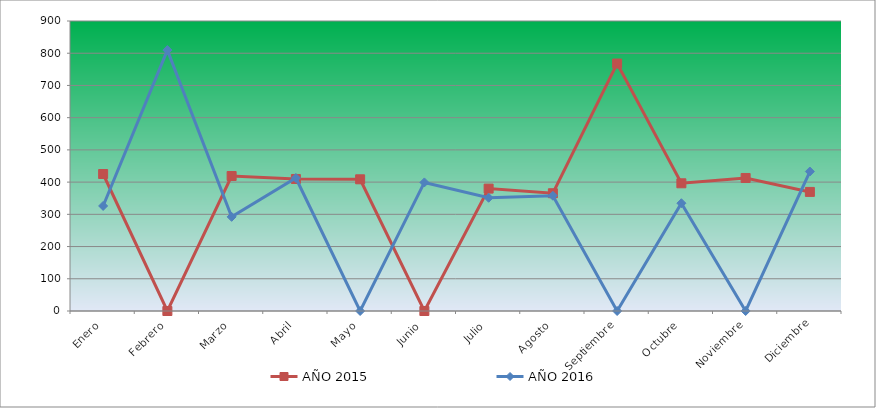
| Category | AÑO 2015 | AÑO 2016 |
|---|---|---|
| Enero | 425.161 | 326.009 |
| Febrero | 0 | 809.73 |
| Marzo | 418.984 | 292.138 |
| Abril | 409.719 | 412.804 |
| Mayo | 408.689 | 0 |
| Junio | 0 | 399.044 |
| Julio | 379.865 | 351.412 |
| Agosto | 365.453 | 357.763 |
| Septiembre | 767.965 | 0 |
| Octubre | 396.336 | 334.477 |
| Noviembre | 412.807 | 0 |
| Diciembre | 369.571 | 432.915 |